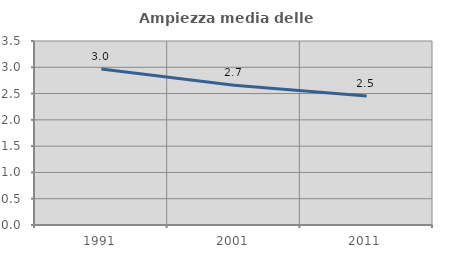
| Category | Ampiezza media delle famiglie |
|---|---|
| 1991.0 | 2.969 |
| 2001.0 | 2.656 |
| 2011.0 | 2.456 |